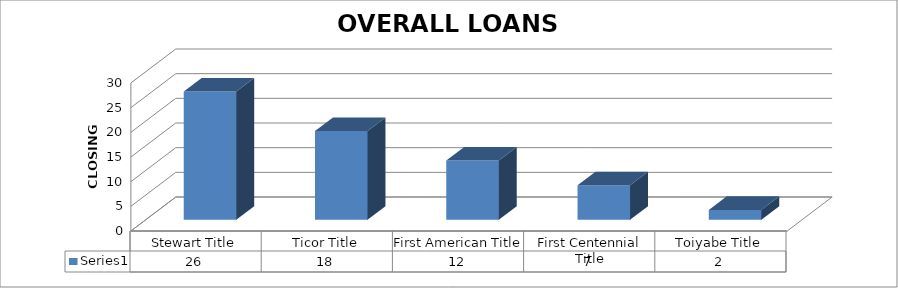
| Category | Series 0 |
|---|---|
| Stewart Title | 26 |
| Ticor Title | 18 |
| First American Title | 12 |
| First Centennial Title | 7 |
| Toiyabe Title | 2 |